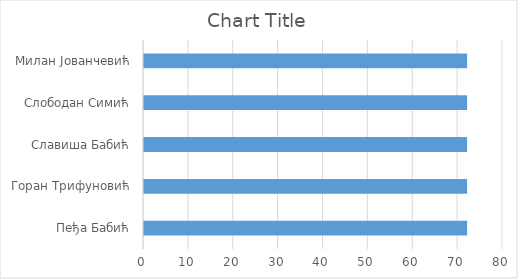
| Category | Series 0 |
|---|---|
| Пеђа Бабић | 72 |
| Горан Трифуновић | 72 |
| Славиша Бабић | 72 |
| Слободан Симић | 72 |
| Милан Јованчевић | 72 |